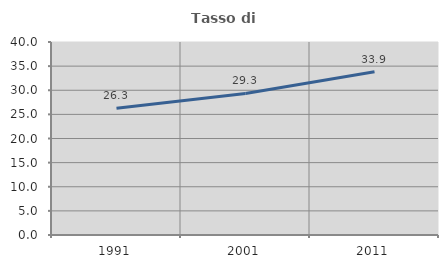
| Category | Tasso di occupazione   |
|---|---|
| 1991.0 | 26.255 |
| 2001.0 | 29.348 |
| 2011.0 | 33.85 |